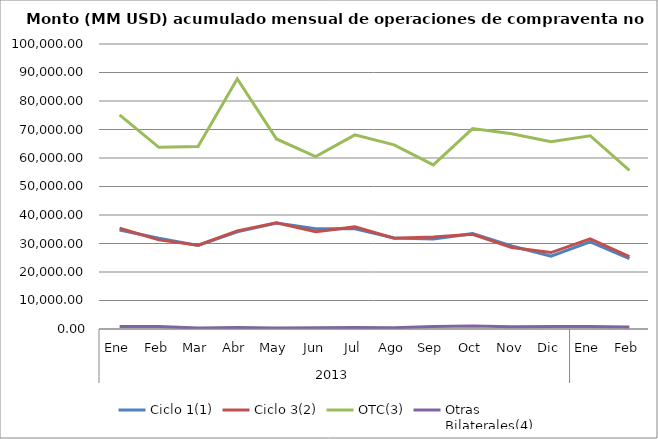
| Category | Ciclo 1(1) | Ciclo 3(2) | OTC(3) | Otras
Bilaterales(4) |
|---|---|---|---|---|
| 0 | 34736.674 | 35336.778 | 75100.994 | 862.558 |
| 1 | 31837.301 | 31276.084 | 63735.014 | 835.426 |
| 2 | 29308.645 | 29417.861 | 64070.642 | 371.583 |
| 3 | 34083.554 | 34428.23 | 87796.406 | 540.738 |
| 4 | 37163.38 | 37242.543 | 66687.424 | 368.797 |
| 5 | 35163.266 | 34165.361 | 60467.987 | 473.52 |
| 6 | 35197.057 | 35828.881 | 68121.887 | 537.978 |
| 7 | 31913.776 | 31846.832 | 64630.867 | 477.656 |
| 8 | 31601.855 | 32260.646 | 57599.123 | 864.94 |
| 9 | 33455.872 | 33201.092 | 70316.044 | 1074.052 |
| 10 | 29141.89 | 28620.849 | 68482.193 | 758.559 |
| 11 | 25532.796 | 26816.016 | 65678.317 | 842.072 |
| 12 | 30609.998 | 31608.391 | 67807.808 | 838.473 |
| 13 | 24661.445 | 25355.64 | 55646.165 | 717.558 |